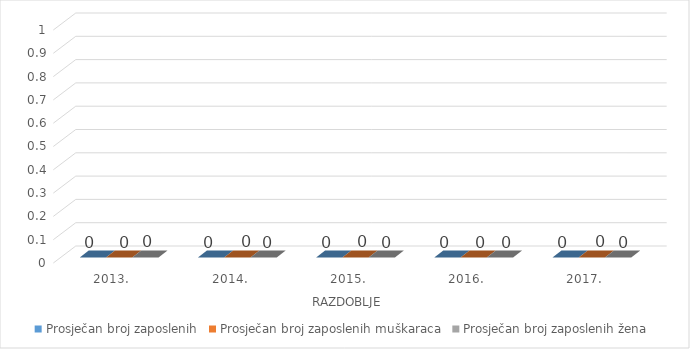
| Category | Prosječan broj zaposlenih | Prosječan broj zaposlenih muškaraca | Prosječan broj zaposlenih žena |
|---|---|---|---|
| 0 | 0 | 0 | 0 |
| 1 | 0 | 0 | 0 |
| 2 | 0 | 0 | 0 |
| 3 | 0 | 0 | 0 |
| 4 | 0 | 0 | 0 |